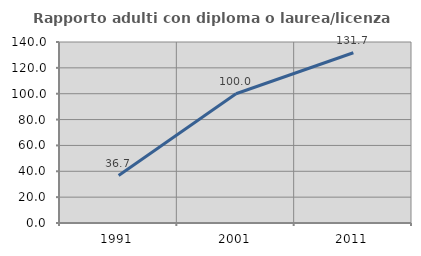
| Category | Rapporto adulti con diploma o laurea/licenza media  |
|---|---|
| 1991.0 | 36.709 |
| 2001.0 | 100 |
| 2011.0 | 131.655 |